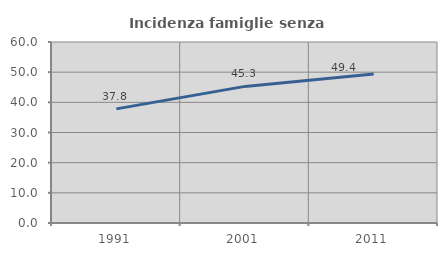
| Category | Incidenza famiglie senza nuclei |
|---|---|
| 1991.0 | 37.833 |
| 2001.0 | 45.283 |
| 2011.0 | 49.385 |